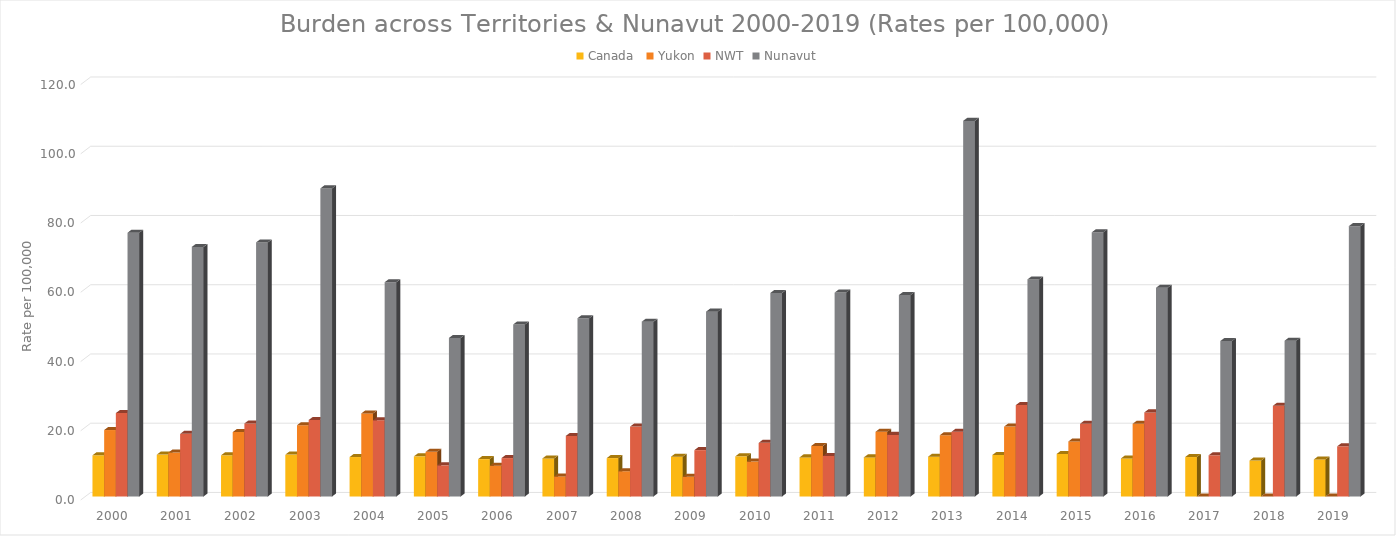
| Category | Canada  | Yukon | NWT | Nunavut |
|---|---|---|---|---|
| 2000.0 | 11.9 | 19.2 | 24.1 | 76.2 |
| 2001.0 | 12.1 | 12.7 | 18.1 | 72.1 |
| 2002.0 | 11.9 | 18.6 | 21.1 | 73.4 |
| 2003.0 | 12.1 | 20.6 | 22.1 | 89 |
| 2004.0 | 11.4 | 24 | 22 | 61.9 |
| 2005.0 | 11.6 | 12.9 | 9 | 45.8 |
| 2006.0 | 10.8 | 8.9 | 11.1 | 49.7 |
| 2007.0 | 11 | 5.8 | 17.5 | 51.5 |
| 2008.0 | 11.1 | 7.3 | 20.2 | 50.5 |
| 2009.0 | 11.5 | 5.7 | 13.4 | 53.4 |
| 2010.0 | 11.6 | 10.1 | 15.5 | 58.8 |
| 2011.0 | 11.3 | 14.6 | 11.7 | 58.9 |
| 2012.0 | 11.3 | 18.7 | 17.8 | 58.2 |
| 2013.0 | 11.5 | 17.7 | 18.7 | 108.5 |
| 2014.0 | 12 | 20.2 | 26.4 | 62.7 |
| 2015.0 | 12.3 | 15.9 | 21 | 76.3 |
| 2016.0 | 11 | 21 | 24.3 | 60.3 |
| 2017.0 | 11.4 | 0 | 11.9 | 44.9 |
| 2018.0 | 10.4 | 0 | 26.2 | 45 |
| 2019.0 | 10.7 | 0 | 14.5 | 78.1 |